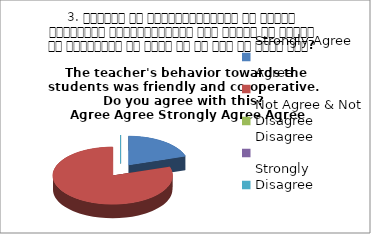
| Category | 3. शिक्षक का विद्यार्थियों के प्रति व्यव्हार मित्रतापूर्ण एवं सहयोग के भावना से परिपूर्ण था क्या आप इस बात से सहमत हैं? 
The teacher's behavior towards the students was friendly and co-operative.  Do you agree with this? 
 Agree Agree Strongly Agree Agree |
|---|---|
| Strongly Agree | 1 |
| Agree | 4 |
| Not Agree & Not Disagree | 0 |
| Disagree | 0 |
| Strongly Disagree | 0 |